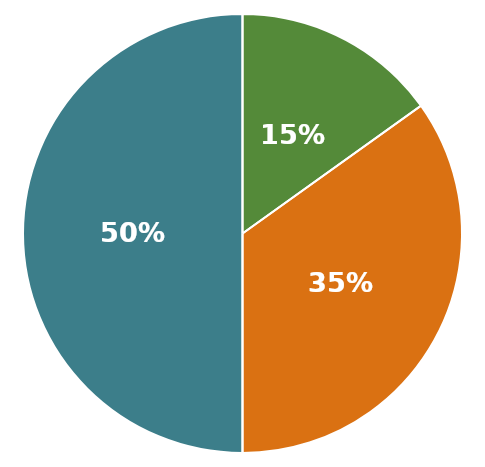
| Category | Total נכסים |
|---|---|
| 0 | 1902500 |
| 1 | 575000 |
| 2 | 1327500 |